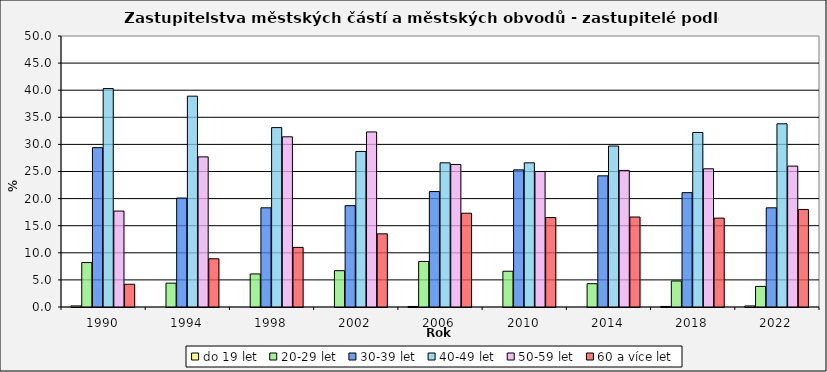
| Category | do 19 let | 20-29 let | 30-39 let | 40-49 let | 50-59 let | 60 a více let |
|---|---|---|---|---|---|---|
| 1990.0 | 0.2 | 8.2 | 29.4 | 40.3 | 17.7 | 4.2 |
| 1994.0 | 0 | 4.4 | 20.1 | 38.9 | 27.7 | 8.9 |
| 1998.0 | 0 | 6.1 | 18.3 | 33.1 | 31.4 | 11 |
| 2002.0 | 0 | 6.7 | 18.7 | 28.7 | 32.3 | 13.5 |
| 2006.0 | 0.1 | 8.4 | 21.3 | 26.6 | 26.3 | 17.3 |
| 2010.0 | 0 | 6.6 | 25.3 | 26.6 | 25 | 16.5 |
| 2014.0 | 0 | 4.3 | 24.2 | 29.7 | 25.2 | 16.6 |
| 2018.0 | 0.1 | 4.8 | 21.1 | 32.2 | 25.5 | 16.4 |
| 2022.0 | 0.2 | 3.8 | 18.3 | 33.8 | 26 | 18 |